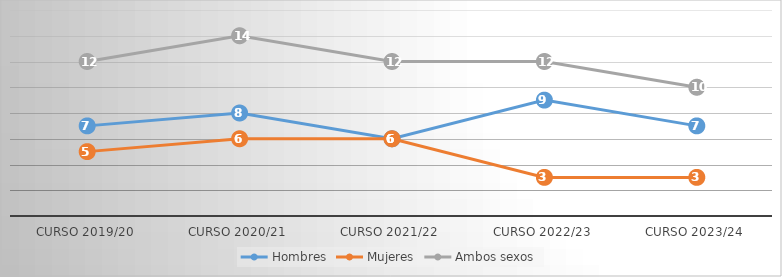
| Category | Hombres | Mujeres | Ambos sexos |
|---|---|---|---|
| Curso 2019/20 | 7 | 5 | 12 |
| Curso 2020/21 | 8 | 6 | 14 |
| Curso 2021/22 | 6 | 6 | 12 |
| Curso 2022/23 | 9 | 3 | 12 |
| Curso 2023/24 | 7 | 3 | 10 |